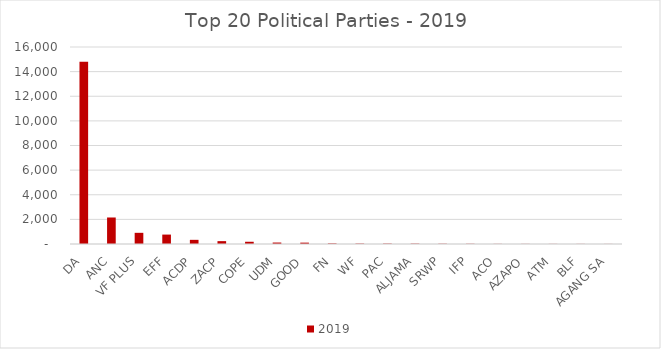
| Category | 2019 |
|---|---|
| DA | 14802 |
| ANC | 2153 |
| VF PLUS | 908 |
| EFF | 765 |
| ACDP | 338 |
| ZACP | 232 |
| COPE | 182 |
| UDM | 118 |
| GOOD | 110 |
| FN | 47 |
| WF | 34 |
| PAC | 33 |
| ALJAMA | 30 |
| SRWP | 22 |
| IFP | 19 |
| ACO | 11 |
| AZAPO | 10 |
| ATM | 9 |
| BLF | 9 |
| AGANG SA | 7 |